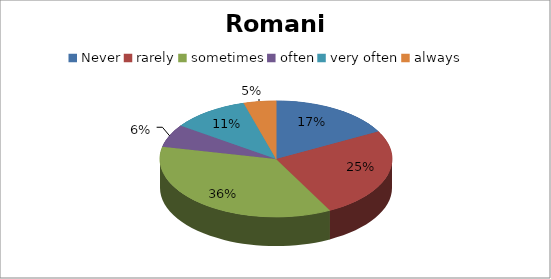
| Category | Series 0 |
|---|---|
| Never | 19 |
| rarely | 28 |
| sometimes | 40 |
| often | 7 |
| very often | 12 |
| always | 5 |